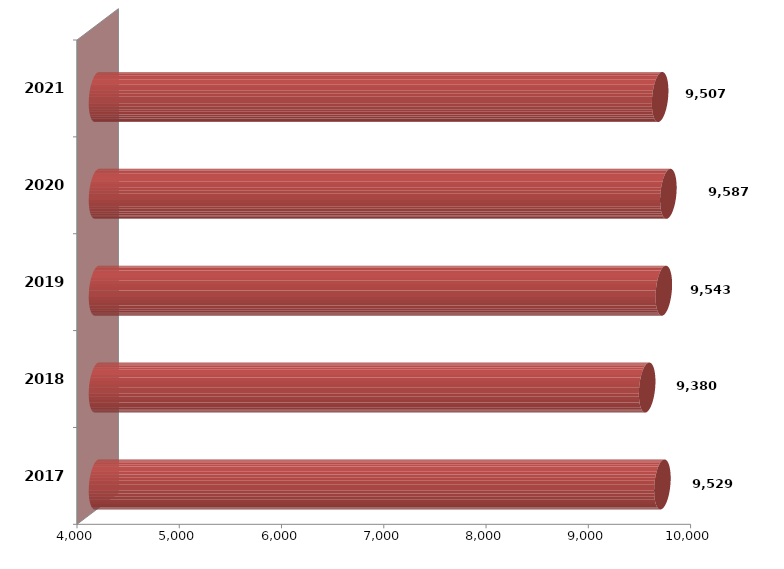
| Category | Series 1 | Series 2 |
|---|---|---|
| 2017 | 9528784.616 |  |
| 2018 | 9379792.504 |  |
| 2019 | 9542655.621 |  |
| 2020 | 9587148.134 |  |
| 2021 | 9506691 |  |